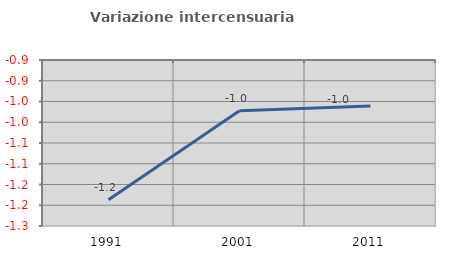
| Category | Variazione intercensuaria annua |
|---|---|
| 1991.0 | -1.187 |
| 2001.0 | -0.972 |
| 2011.0 | -0.961 |